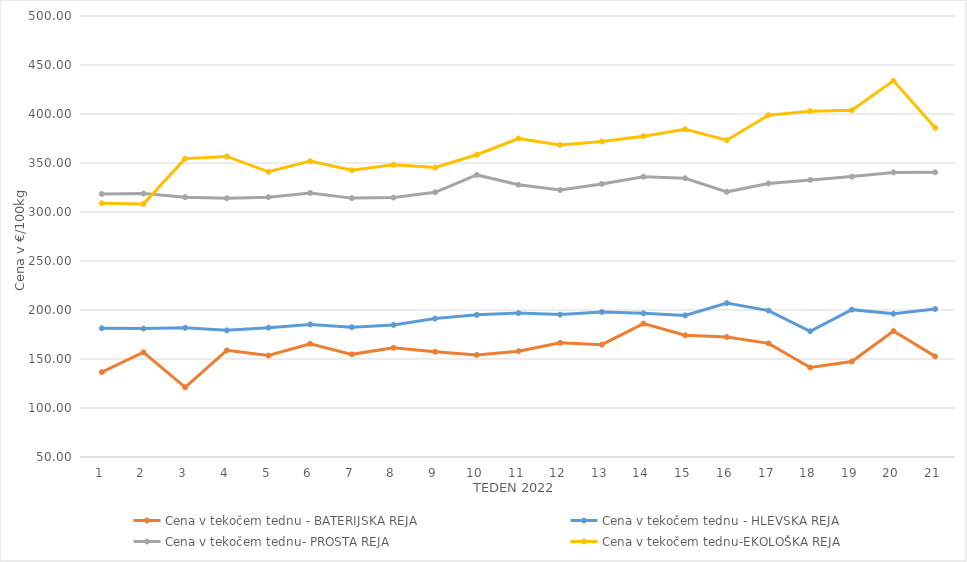
| Category | Cena v tekočem tednu - BATERIJSKA REJA | Cena v tekočem tednu - HLEVSKA REJA | Cena v tekočem tednu- PROSTA REJA | Cena v tekočem tednu-EKOLOŠKA REJA |
|---|---|---|---|---|
| 1.0 | 136.59 | 181.38 | 318.4 | 308.97 |
| 2.0 | 156.88 | 181.07 | 318.82 | 308.28 |
| 3.0 | 121.07 | 181.83 | 315.14 | 354.48 |
| 4.0 | 158.82 | 179.22 | 314.08 | 356.72 |
| 5.0 | 153.55 | 181.96 | 315.1 | 341.03 |
| 6.0 | 165.51 | 185.31 | 319.38 | 351.9 |
| 7.0 | 154.74 | 182.45 | 314.16 | 342.59 |
| 8.0 | 161.48 | 184.77 | 314.71 | 348.28 |
| 9.0 | 157.38 | 191.21 | 320.1 | 345.35 |
| 10.0 | 154.16 | 195.04 | 337.83 | 358.45 |
| 11.0 | 157.96 | 196.88 | 327.79 | 375 |
| 12.0 | 166.49 | 195.36 | 322.46 | 368.45 |
| 13.0 | 164.66 | 197.95 | 328.67 | 371.9 |
| 14.0 | 186.11 | 196.59 | 336.02 | 377.24 |
| 15.0 | 174.18 | 194.49 | 334.46 | 384.48 |
| 16.0 | 172.42 | 207.1 | 320.58 | 373.28 |
| 17.0 | 165.96 | 199.41 | 329.11 | 398.79 |
| 18.0 | 141.36 | 178.29 | 332.71 | 402.93 |
| 19.0 | 147.43 | 200.37 | 336.11 | 403.79 |
| 20.0 | 178.51 | 196.16 | 340.4 | 433.97 |
| 21.0 | 152.67 | 201.05 | 340.55 | 385.86 |